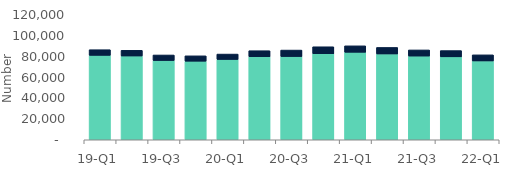
| Category | Homeowners | Buy-to-let |
|---|---|---|
| 19-Q1 | 81050 | 5420 |
| 19-Q2 | 80420 | 5470 |
| 19-Q3 | 76110 | 5290 |
| 19-Q4 | 75430 | 5160 |
| 20-Q1 | 77090 | 5200 |
| 20-Q2 | 79710 | 5800 |
| 20-Q3 | 79900 | 6220 |
| 20-Q4 | 82610 | 6700 |
| 21-Q1 | 84010 | 6180 |
| 21-Q2 | 82380 | 6260 |
| 21-Q3 | 80370 | 5880 |
| 21-Q4 | 79620 | 6010 |
| 22-Q1 | 75670 | 5860 |